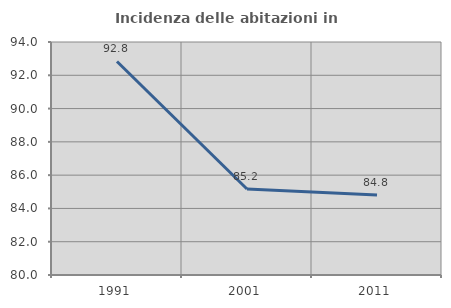
| Category | Incidenza delle abitazioni in proprietà  |
|---|---|
| 1991.0 | 92.829 |
| 2001.0 | 85.165 |
| 2011.0 | 84.806 |